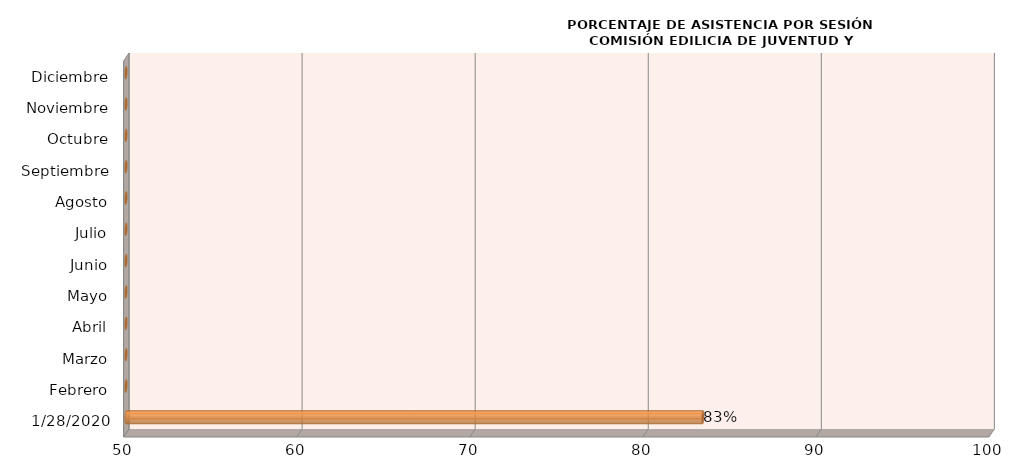
| Category | Series 0 |
|---|---|
| 28/01/2020 | 83.333 |
| Febrero | 0 |
| Marzo | 0 |
| Abril | 0 |
| Mayo | 0 |
| Junio | 0 |
| Julio | 0 |
| Agosto | 0 |
| Septiembre | 0 |
| Octubre | 0 |
| Noviembre | 0 |
| Diciembre | 0 |